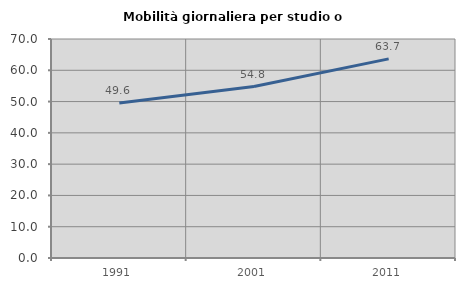
| Category | Mobilità giornaliera per studio o lavoro |
|---|---|
| 1991.0 | 49.575 |
| 2001.0 | 54.811 |
| 2011.0 | 63.655 |